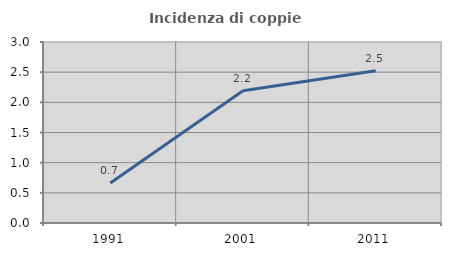
| Category | Incidenza di coppie miste |
|---|---|
| 1991.0 | 0.664 |
| 2001.0 | 2.192 |
| 2011.0 | 2.525 |